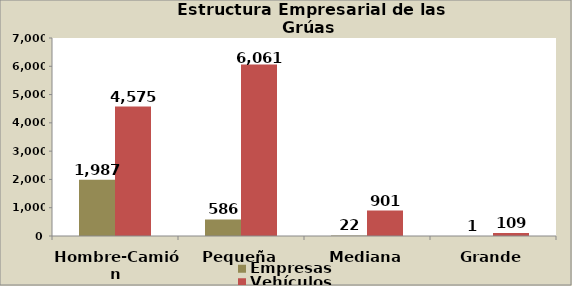
| Category | Empresas | Vehículos |
|---|---|---|
| Hombre-Camión | 1987 | 4575 |
| Pequeña | 586 | 6061 |
| Mediana | 22 | 901 |
| Grande | 1 | 109 |